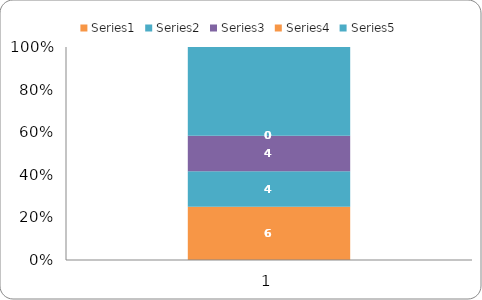
| Category | Series 0 | Series 1 | Series 2 | Series 3 | Series 4 |
|---|---|---|---|---|---|
| 0 | 6 | 4 | 4 | 0 | 10 |